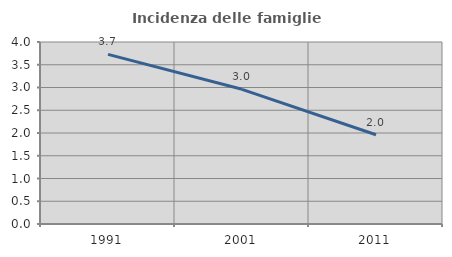
| Category | Incidenza delle famiglie numerose |
|---|---|
| 1991.0 | 3.729 |
| 2001.0 | 2.961 |
| 2011.0 | 1.962 |